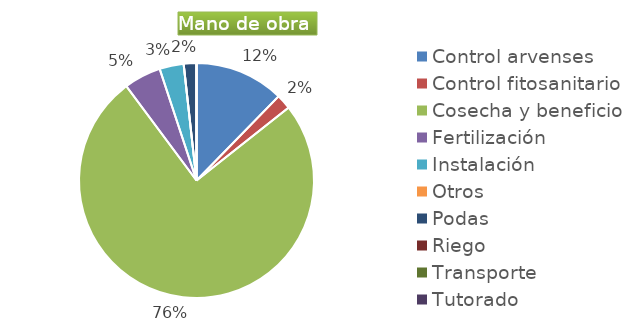
| Category | Series 0 |
|---|---|
| Control arvenses | 9790861 |
| Control fitosanitario | 1626968 |
| Cosecha y beneficio | 60071166 |
| Fertilización | 4067420 |
| Instalación | 2643823 |
| Otros | 0 |
| Podas | 1394544 |
| Riego | 0 |
| Transporte | 0 |
| Tutorado | 0 |